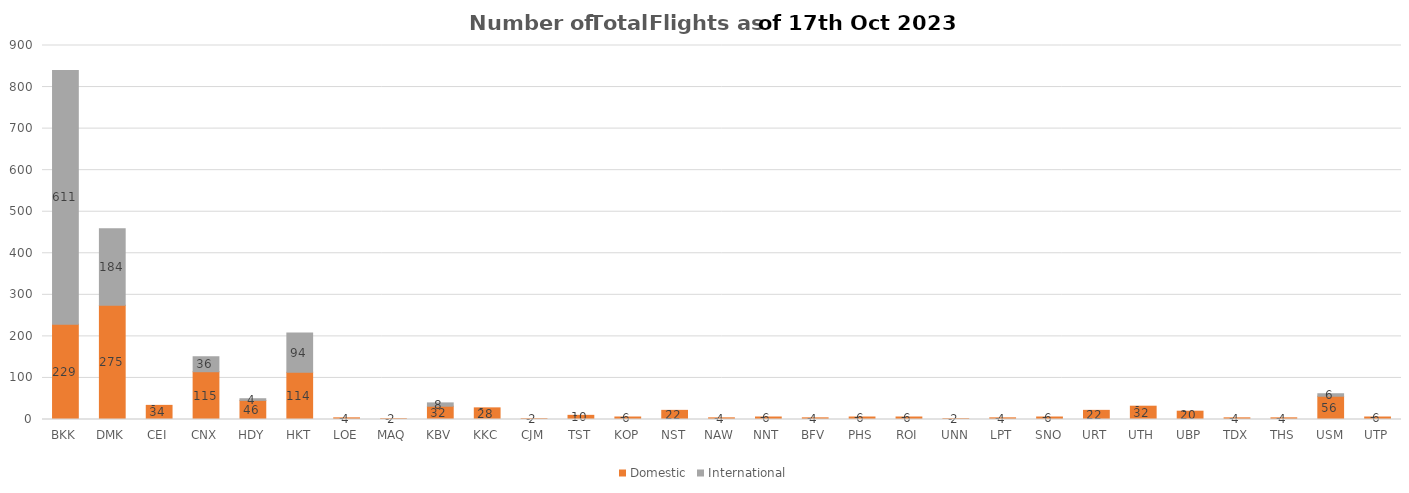
| Category | Domestic | International |
|---|---|---|
| BKK | 229 | 611 |
| DMK | 275 | 184 |
| CEI | 34 | 0 |
| CNX | 115 | 36 |
| HDY | 46 | 4 |
| HKT | 114 | 94 |
| LOE | 4 | 0 |
| MAQ | 2 | 0 |
| KBV | 32 | 8 |
| KKC | 28 | 0 |
| CJM | 2 | 0 |
| TST | 10 | 0 |
| KOP | 6 | 0 |
| NST | 22 | 0 |
| NAW | 4 | 0 |
| NNT | 6 | 0 |
| BFV | 4 | 0 |
| PHS | 6 | 0 |
| ROI | 6 | 0 |
| UNN | 2 | 0 |
| LPT | 4 | 0 |
| SNO | 6 | 0 |
| URT | 22 | 0 |
| UTH | 32 | 0 |
| UBP | 20 | 0 |
| TDX | 4 | 0 |
| THS | 4 | 0 |
| USM | 56 | 6 |
| UTP | 6 | 0 |